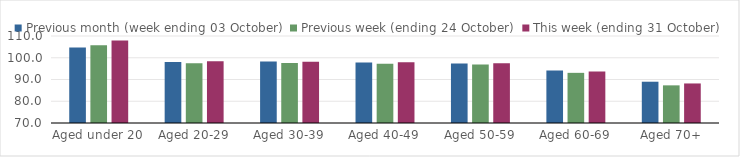
| Category | Previous month (week ending 03 October) | Previous week (ending 24 October) | This week (ending 31 October) |
|---|---|---|---|
| Aged under 20 | 104.73 | 105.74 | 107.97 |
| Aged 20-29 | 97.99 | 97.5 | 98.39 |
| Aged 30-39 | 98.31 | 97.63 | 98.18 |
| Aged 40-49 | 97.76 | 97.26 | 97.91 |
| Aged 50-59 | 97.38 | 96.84 | 97.5 |
| Aged 60-69 | 94.15 | 93.06 | 93.66 |
| Aged 70+ | 88.98 | 87.31 | 88.18 |